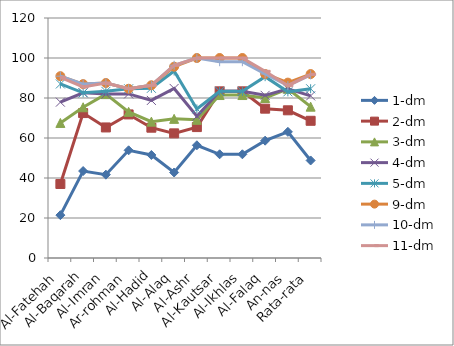
| Category | 1-dm | 2-dm | 3-dm | 4-dm | 5-dm | 9-dm | 10-dm | 11-dm |
|---|---|---|---|---|---|---|---|---|
| Al-Fatehah | 21.429 | 37.013 | 67.532 | 77.922 | 87.013 | 90.909 | 90.909 | 90.26 |
| Al-Baqarah | 43.478 | 72.464 | 75.362 | 82.609 | 82.609 | 86.957 | 86.957 | 85.507 |
| Al-Imran | 41.667 | 65.278 | 81.944 | 81.944 | 83.333 | 87.5 | 87.5 | 87.5 |
| Ar-rohman | 53.846 | 71.795 | 73.077 | 82.051 | 84.615 | 84.615 | 84.615 | 84.615 |
| Al-Hadid | 51.515 | 65.152 | 68.182 | 78.788 | 84.848 | 86.364 | 86.364 | 86.364 |
| Al-Alaq | 42.754 | 62.319 | 69.565 | 84.783 | 93.478 | 95.652 | 96.377 | 96.377 |
| Al-Ashr | 56.364 | 65.455 | 69.091 | 70.909 | 74.545 | 100 | 100 | 100 |
| Al-Kautsar | 51.852 | 83.333 | 81.481 | 83.333 | 83.333 | 100 | 98.148 | 100 |
| Al-Ikhlas | 51.852 | 83.333 | 81.481 | 83.333 | 83.333 | 100 | 98.148 | 100 |
| Al-Falaq | 58.667 | 74.667 | 80 | 81.333 | 90.667 | 92 | 92 | 93.333 |
| An-nas | 63.077 | 73.846 | 84.615 | 84.615 | 83.077 | 87.692 | 86.154 | 86.154 |
| Rata-rata | 48.773 | 68.605 | 75.667 | 81.056 | 84.623 | 91.972 | 91.561 | 91.828 |